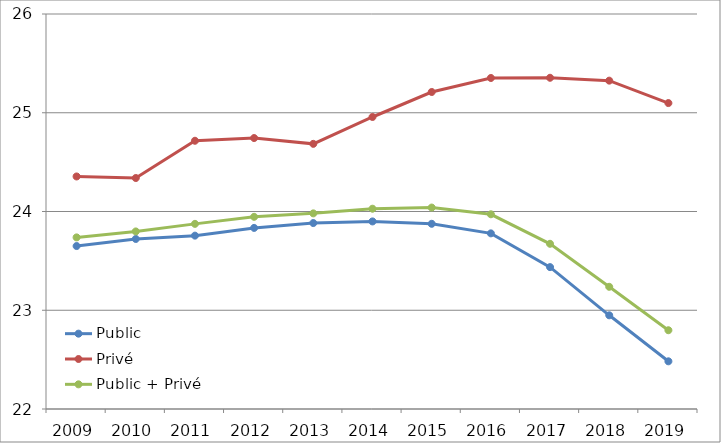
| Category | Public | Privé | Public + Privé |
|---|---|---|---|
| 2009.0 | 23.65 | 24.355 | 23.738 |
| 2010.0 | 23.722 | 24.339 | 23.798 |
| 2011.0 | 23.756 | 24.716 | 23.875 |
| 2012.0 | 23.834 | 24.744 | 23.946 |
| 2013.0 | 23.883 | 24.685 | 23.981 |
| 2014.0 | 23.899 | 24.957 | 24.028 |
| 2015.0 | 23.875 | 25.21 | 24.04 |
| 2016.0 | 23.779 | 25.352 | 23.972 |
| 2017.0 | 23.437 | 25.354 | 23.673 |
| 2018.0 | 22.949 | 25.325 | 23.237 |
| 2019.0 | 22.483 | 25.098 | 22.798 |